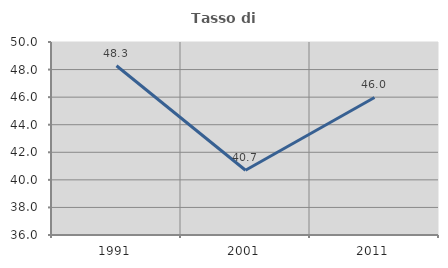
| Category | Tasso di occupazione   |
|---|---|
| 1991.0 | 48.276 |
| 2001.0 | 40.698 |
| 2011.0 | 45.977 |